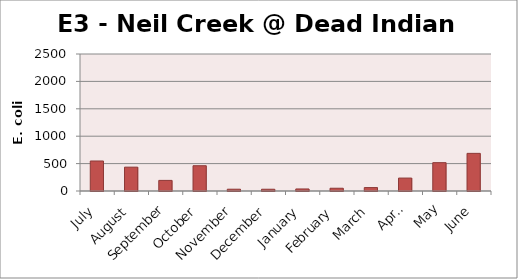
| Category | E. coli MPN |
|---|---|
| July | 547.5 |
| August | 435.2 |
| September | 193.5 |
| October | 461.1 |
| November | 32.7 |
| December | 32 |
| January | 37.3 |
| February | 50.4 |
| March | 62.4 |
| April | 235.9 |
| May | 517.2 |
| June | 686.7 |